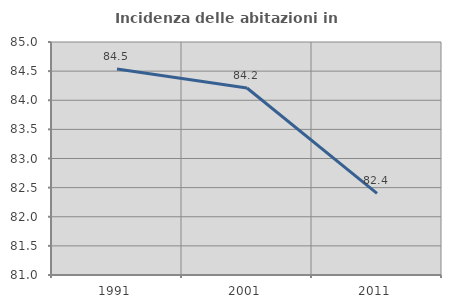
| Category | Incidenza delle abitazioni in proprietà  |
|---|---|
| 1991.0 | 84.536 |
| 2001.0 | 84.211 |
| 2011.0 | 82.4 |